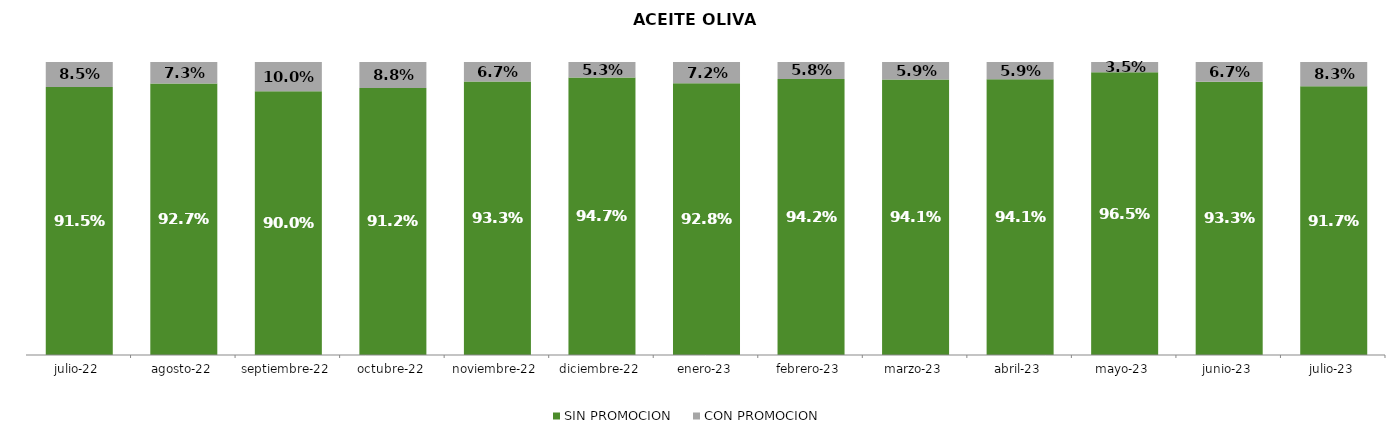
| Category | SIN PROMOCION   | CON PROMOCION   |
|---|---|---|
| 2022-07-01 | 0.915 | 0.085 |
| 2022-08-01 | 0.927 | 0.073 |
| 2022-09-01 | 0.9 | 0.1 |
| 2022-10-01 | 0.912 | 0.088 |
| 2022-11-01 | 0.933 | 0.067 |
| 2022-12-01 | 0.947 | 0.053 |
| 2023-01-01 | 0.928 | 0.072 |
| 2023-02-01 | 0.942 | 0.058 |
| 2023-03-01 | 0.941 | 0.059 |
| 2023-04-01 | 0.941 | 0.059 |
| 2023-05-01 | 0.965 | 0.035 |
| 2023-06-01 | 0.933 | 0.067 |
| 2023-07-01 | 0.917 | 0.083 |